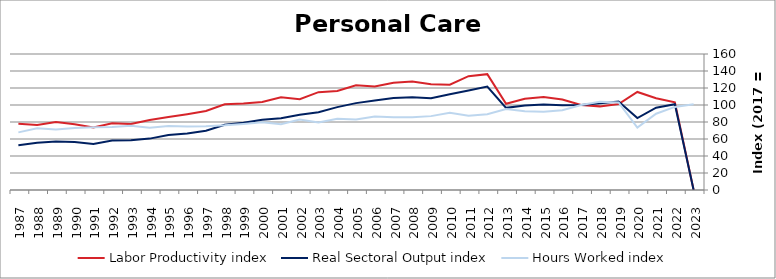
| Category | Labor Productivity index | Real Sectoral Output index | Hours Worked index |
|---|---|---|---|
| 2023.0 | 0 | 0 | 100.791 |
| 2022.0 | 103.254 | 100.965 | 97.783 |
| 2021.0 | 107.981 | 96.887 | 89.725 |
| 2020.0 | 115.33 | 84.568 | 73.327 |
| 2019.0 | 101.098 | 104.203 | 103.071 |
| 2018.0 | 98.386 | 102.062 | 103.736 |
| 2017.0 | 100 | 100 | 100 |
| 2016.0 | 106.433 | 99.753 | 93.724 |
| 2015.0 | 109.421 | 100.709 | 92.039 |
| 2014.0 | 107.32 | 99.411 | 92.631 |
| 2013.0 | 101.5 | 96.637 | 95.209 |
| 2012.0 | 136.314 | 121.661 | 89.251 |
| 2011.0 | 133.89 | 117.112 | 87.469 |
| 2010.0 | 123.941 | 112.651 | 90.891 |
| 2009.0 | 124.338 | 108.066 | 86.913 |
| 2008.0 | 127.604 | 109.03 | 85.444 |
| 2007.0 | 126.23 | 108.156 | 85.682 |
| 2006.0 | 121.884 | 105.378 | 86.458 |
| 2005.0 | 123.095 | 102.206 | 83.03 |
| 2004.0 | 116.502 | 97.517 | 83.704 |
| 2003.0 | 115.076 | 91.512 | 79.523 |
| 2002.0 | 106.753 | 88.625 | 83.019 |
| 2001.0 | 109.017 | 84.412 | 77.43 |
| 2000.0 | 103.487 | 82.515 | 79.735 |
| 1999.0 | 101.697 | 79.092 | 77.772 |
| 1998.0 | 100.899 | 76.763 | 76.079 |
| 1997.0 | 92.868 | 69.696 | 75.049 |
| 1996.0 | 89.178 | 66.531 | 74.605 |
| 1995.0 | 85.872 | 64.696 | 75.34 |
| 1994.0 | 82.403 | 60.458 | 73.369 |
| 1993.0 | 77.643 | 58.591 | 75.463 |
| 1992.0 | 78.382 | 58.15 | 74.187 |
| 1991.0 | 73.439 | 54.258 | 73.882 |
| 1990.0 | 77.427 | 56.409 | 72.855 |
| 1989.0 | 79.981 | 56.945 | 71.198 |
| 1988.0 | 76.491 | 55.521 | 72.585 |
| 1987.0 | 77.844 | 52.766 | 67.784 |